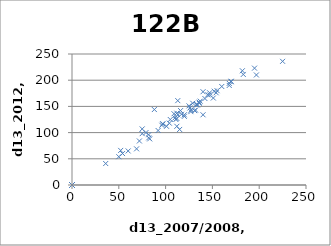
| Category | Series 0 |
|---|---|
| 151.0 | 166 |
| 152.0 | 179 |
| 145.0 | 172 |
| 129.0 | 156 |
| 155.0 | 180 |
| 225.0 | 236 |
| 120.0 | 131 |
| 182.0 | 218 |
| 109.0 | 136 |
| 170.0 | 197 |
| 195.0 | 223 |
| 113.0 | 134 |
| 133.0 | 153 |
| 168.0 | 190 |
| 168.0 | 194 |
| 0.0 | 0 |
| 147.0 | 172 |
| 0.0 | 0 |
| 133.0 | 154 |
| 0.0 | 0 |
| 116.0 | 142 |
| 112.0 | 112 |
| 147.0 | 176 |
| 142.0 | 165 |
| 126.0 | 147 |
| 96.0 | 114 |
| 83.0 | 88 |
| 112.0 | 127 |
| 197.0 | 210 |
| 97.0 | 117 |
| 154.0 | 176 |
| 120.0 | 134 |
| 0.0 | 0 |
| 170.0 | 198 |
| 69.0 | 69 |
| 127.0 | 143 |
| 183.0 | 211 |
| 136.0 | 156 |
| 125.0 | 151 |
| 134.0 | 153 |
| 131.0 | 142 |
| 136.0 | 158 |
| 101.0 | 112 |
| 88.0 | 144 |
| 115.0 | 106 |
| 0.0 | 0 |
| 82.0 | 96 |
| 137.0 | 160 |
| 75.0 | 98 |
| 82.0 | 90 |
| 72.0 | 84 |
| 50.0 | 54 |
| 36.0 | 41 |
| 0.0 | 0 |
| 0.0 | 0 |
| 132.0 | 143 |
| 0.0 | 0 |
| 54.0 | 60 |
| 0.0 | 0 |
| 112.0 | 137 |
| 111.0 | 125 |
| 117.0 | 135 |
| 140.0 | 178 |
| 0.0 | 0 |
| 0.0 | 0 |
| 0.0 | 0 |
| 75.0 | 107 |
| 0.0 | 0 |
| 97.0 | 116 |
| 104.0 | 118 |
| 0.0 | 0 |
| 0.0 | 0 |
| 52.0 | 66 |
| 60.0 | 65 |
| 0.0 | 0 |
| 0.0 | 0 |
| 105.0 | 125 |
| 113.0 | 161 |
| 140.0 | 134 |
| 79.0 | 100 |
| 127.0 | 140 |
| 0.0 | 0 |
| 92.0 | 104 |
| 160.0 | 188 |
| 110.0 | 128 |
| 0.0 | 0 |
| 0.0 | 0 |
| 0.0 | 0 |
| 0.0 | 0 |
| 0.0 | 0 |
| 0.0 | 0 |
| 0.0 | 0 |
| 0.0 | 0 |
| 0.0 | 0 |
| 0.0 | 0 |
| 0.0 | 0 |
| 0.0 | 0 |